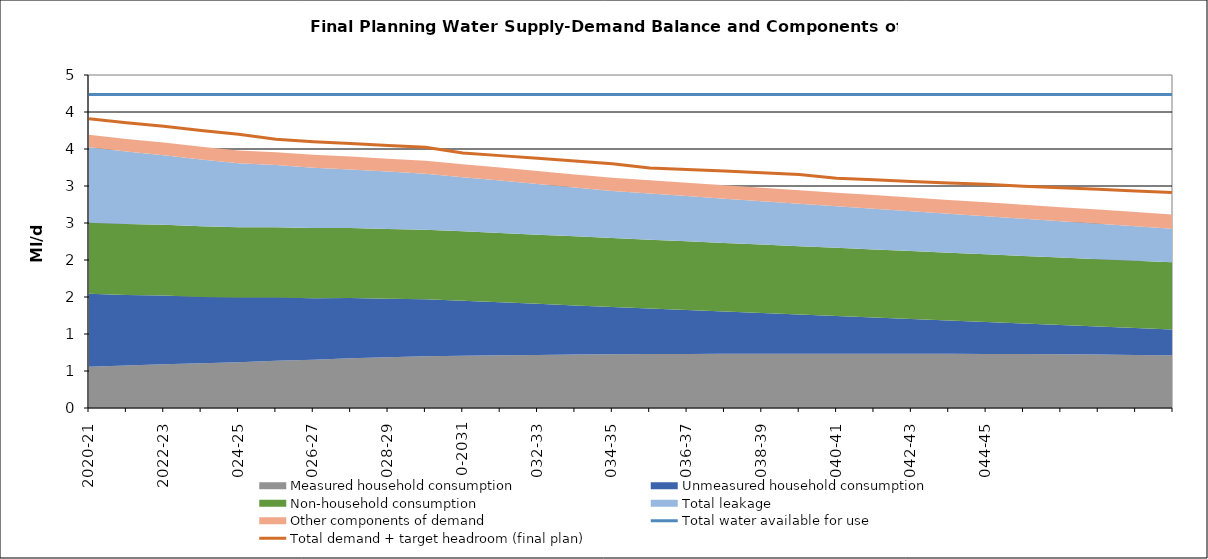
| Category | Total water available for use | Total demand + target headroom (final plan) |
|---|---|---|
| 2020-21 | 4.238 | 3.908 |
| 2021-22 | 4.238 | 3.854 |
| 2022-23 | 4.238 | 3.808 |
| 2023-24 | 4.238 | 3.749 |
| 2024-25 | 4.238 | 3.699 |
| 2025-26 | 4.238 | 3.632 |
| 2026-27 | 4.238 | 3.599 |
| 2027-28 | 4.238 | 3.575 |
| 2028-29 | 4.238 | 3.548 |
| 2029-30 | 4.238 | 3.523 |
| 2030-31 | 4.238 | 3.447 |
| 2031-32 | 4.238 | 3.41 |
| 2032-33 | 4.238 | 3.374 |
| 2033-34 | 4.238 | 3.339 |
| 2034-35 | 4.238 | 3.302 |
| 2035-36 | 4.238 | 3.244 |
| 2036-37 | 4.238 | 3.224 |
| 2037-38 | 4.238 | 3.202 |
| 2038-39 | 4.238 | 3.18 |
| 2039-40 | 4.238 | 3.155 |
| 2040-41 | 4.238 | 3.106 |
| 2041-42 | 4.238 | 3.084 |
| 2042-43 | 4.238 | 3.061 |
| 2043-44 | 4.238 | 3.041 |
| 2044-45 | 4.238 | 3.023 |
| 2045-46 | 4.238 | 2.997 |
| 2046-47 | 4.238 | 2.976 |
| 2047-48 | 4.238 | 2.955 |
| 2048-49 | 4.238 | 2.934 |
| 2049-50 | 4.238 | 2.913 |